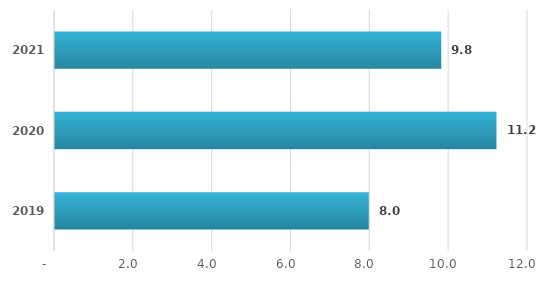
| Category | Series 0 |
|---|---|
| 2019.0 | 7.961 |
| 2020.0 | 11.2 |
| 2021.0 | 9.8 |